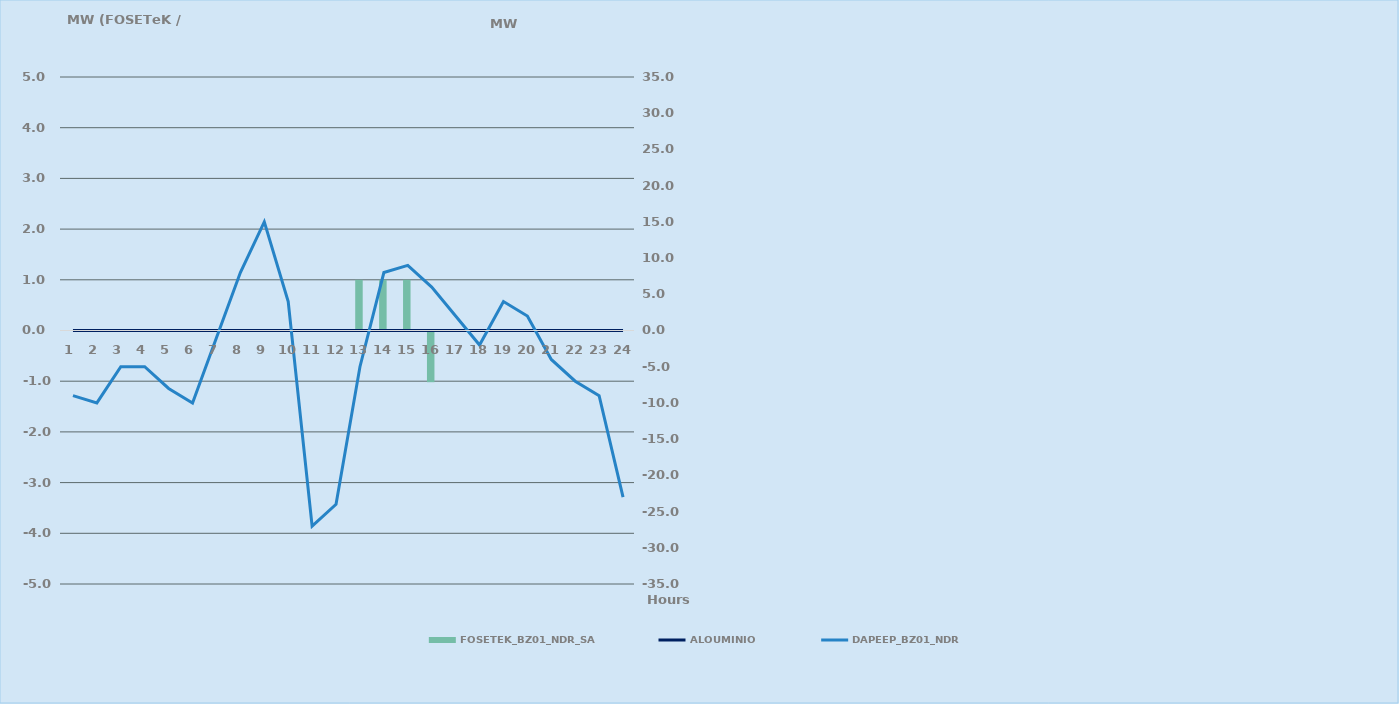
| Category | FOSETEK_BZ01_NDR_SA |
|---|---|
| 0 | 0 |
| 1 | 0 |
| 2 | 0 |
| 3 | 0 |
| 4 | 0 |
| 5 | 0 |
| 6 | 0 |
| 7 | 0 |
| 8 | 0 |
| 9 | 0 |
| 10 | 0 |
| 11 | 0 |
| 12 | 1 |
| 13 | 1 |
| 14 | 1 |
| 15 | -1 |
| 16 | 0 |
| 17 | 0 |
| 18 | 0 |
| 19 | 0 |
| 20 | 0 |
| 21 | 0 |
| 22 | 0 |
| 23 | 0 |